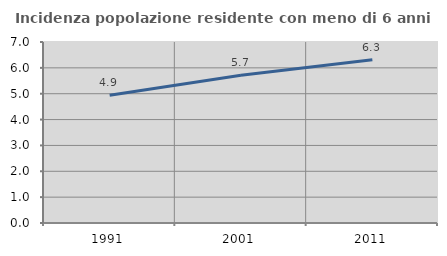
| Category | Incidenza popolazione residente con meno di 6 anni |
|---|---|
| 1991.0 | 4.94 |
| 2001.0 | 5.711 |
| 2011.0 | 6.313 |